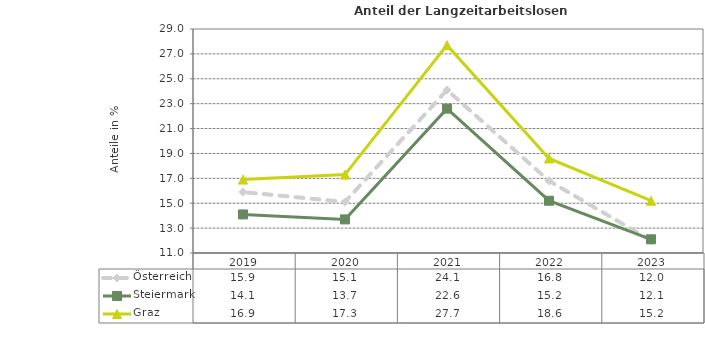
| Category | Österreich | Steiermark | Graz |
|---|---|---|---|
| 2023.0 | 12 | 12.1 | 15.2 |
| 2022.0 | 16.8 | 15.2 | 18.6 |
| 2021.0 | 24.1 | 22.6 | 27.7 |
| 2020.0 | 15.1 | 13.7 | 17.3 |
| 2019.0 | 15.9 | 14.1 | 16.9 |